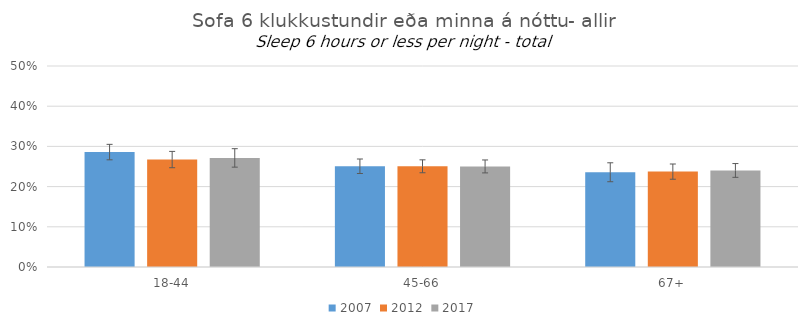
| Category | 2007 | 2012 | 2017 |
|---|---|---|---|
| 18-44 | 0.286 | 0.267 | 0.271 |
| 45-66 | 0.251 | 0.251 | 0.25 |
| 67+ | 0.236 | 0.237 | 0.24 |